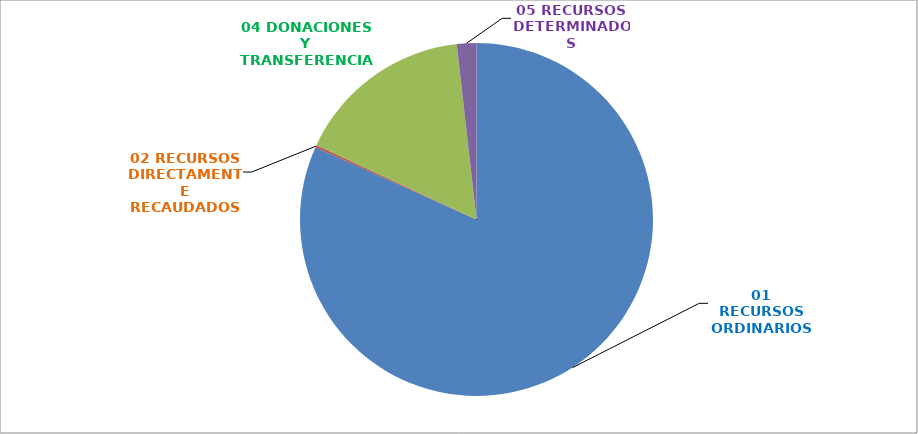
| Category | 445 REGION CAJAMARCA |
|---|---|
| 01 RECURSOS ORDINARIOS | 0.817 |
| 02 RECURSOS DIRECTAMENTE RECAUDADOS | 0.002 |
| 04 DONACIONES Y TRANSFERENCIAS | 0.163 |
| 05 RECURSOS DETERMINADOS | 0.018 |